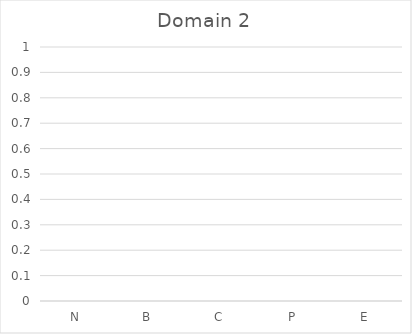
| Category | Domain 2 |
|---|---|
| N | 0 |
| B | 0 |
| C | 0 |
| P | 0 |
| E | 0 |